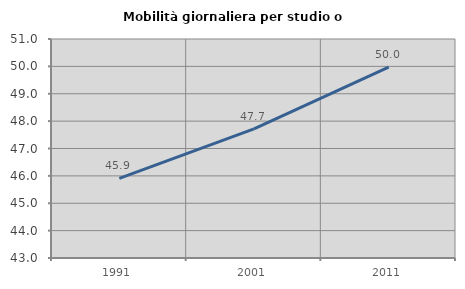
| Category | Mobilità giornaliera per studio o lavoro |
|---|---|
| 1991.0 | 45.907 |
| 2001.0 | 47.715 |
| 2011.0 | 49.971 |